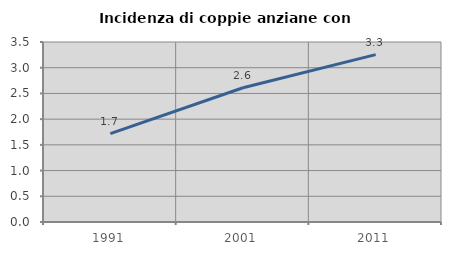
| Category | Incidenza di coppie anziane con figli |
|---|---|
| 1991.0 | 1.718 |
| 2001.0 | 2.611 |
| 2011.0 | 3.254 |